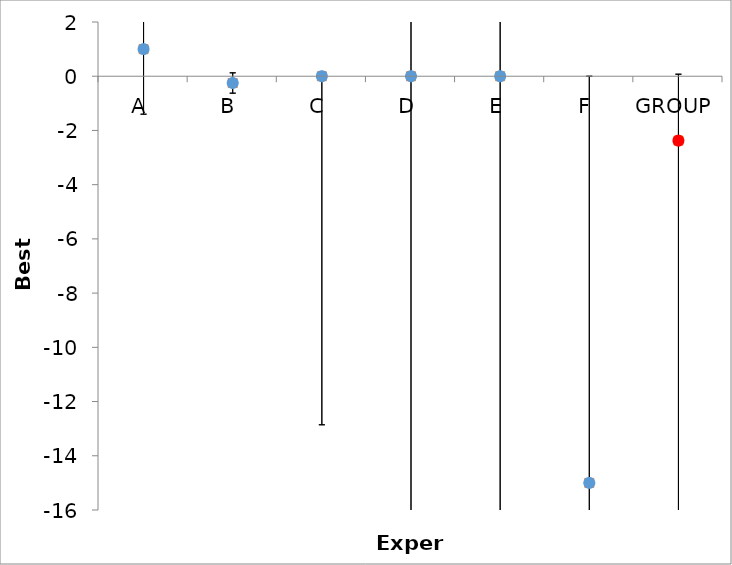
| Category | Series 1 | Series 0 |
|---|---|---|
| A | 1 | 1 |
| B | -0.25 | -0.25 |
| C | 0 | 0 |
| D | 0 | 0 |
| E | 0 | 0 |
| F | -15 | -15 |
| GROUP | -2.375 | -2.375 |